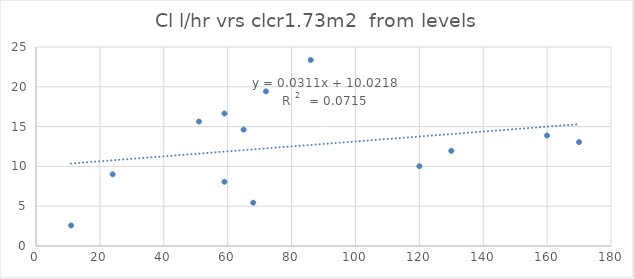
| Category | Series 0 |
|---|---|
| 72.0 | 19.425 |
| 11.0 | 2.581 |
| 68.0 | 5.437 |
| 24.0 | 9 |
| 51.0 | 15.634 |
| 59.0 | 8.073 |
| 120.0 | 10.026 |
| 65.0 | 14.62 |
| 130.0 | 11.954 |
| 170.0 | 13.059 |
| 160.0 | 13.875 |
| 59.0 | 16.65 |
| 86.0 | 23.368 |